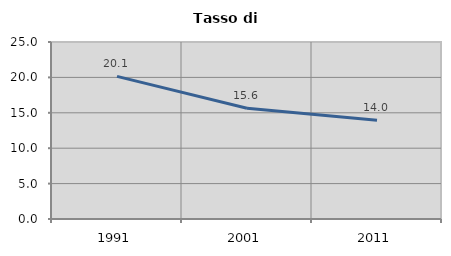
| Category | Tasso di disoccupazione   |
|---|---|
| 1991.0 | 20.139 |
| 2001.0 | 15.649 |
| 2011.0 | 13.953 |